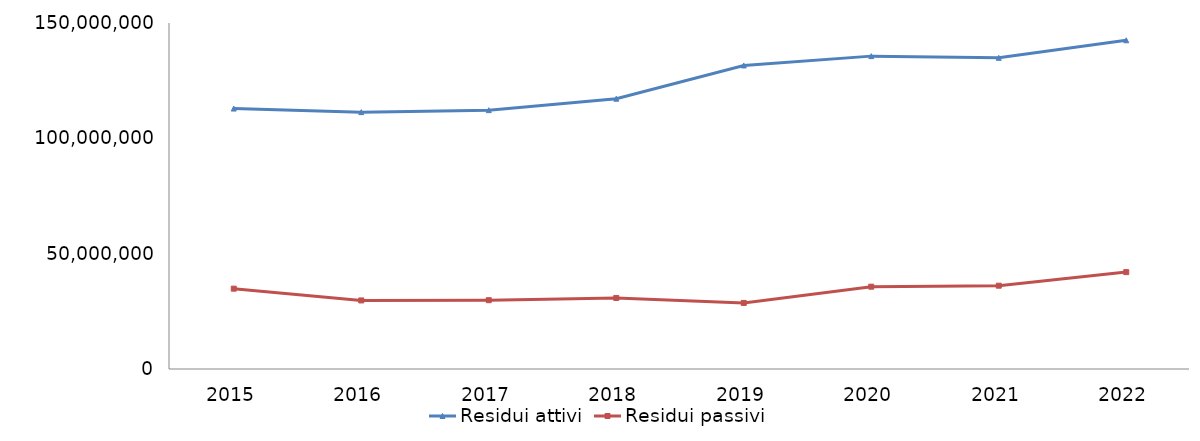
| Category | Residui attivi | Residui passivi |
|---|---|---|
| 2015.0 | 112910882.72 | 34828493.54 |
| 2016.0 | 111354733.87 | 29727250.52 |
| 2017.0 | 112218204.11 | 29831407.64 |
| 2018.0 | 117186963.28 | 30797157.25 |
| 2019.0 | 131600937.58 | 28645349.5 |
| 2020.0 | 135638507.6 | 35686402.71 |
| 2021.0 | 134911036.24 | 36111718.8 |
| 2022.0 | 142512500.99 | 42001567.57 |